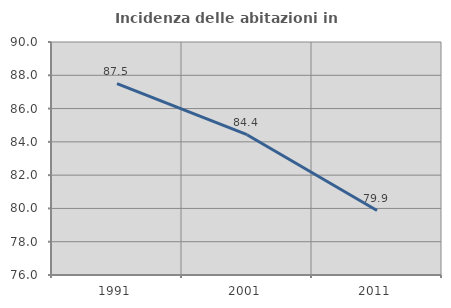
| Category | Incidenza delle abitazioni in proprietà  |
|---|---|
| 1991.0 | 87.5 |
| 2001.0 | 84.431 |
| 2011.0 | 79.875 |